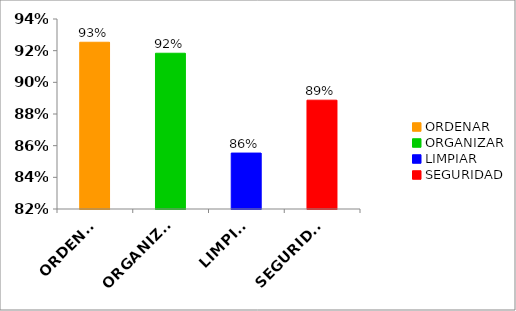
| Category | Series 0 |
|---|---|
| ORDENAR | 0.925 |
| ORGANIZAR | 0.918 |
| LIMPIAR | 0.855 |
| SEGURIDAD | 0.889 |